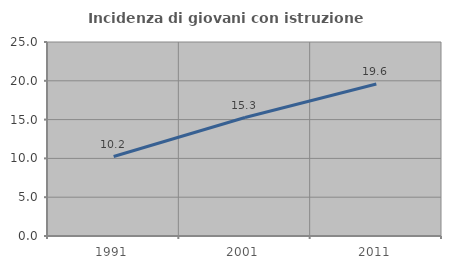
| Category | Incidenza di giovani con istruzione universitaria |
|---|---|
| 1991.0 | 10.239 |
| 2001.0 | 15.266 |
| 2011.0 | 19.583 |